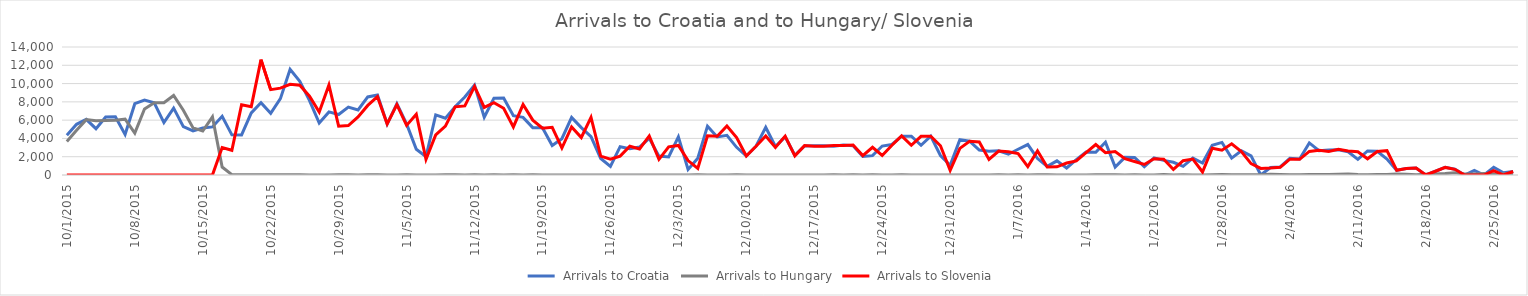
| Category | Series 0 | Series 1 | Series 2 |
|---|---|---|---|
| 10/1/15 | 4344 | 3667 | 0 |
| 10/2/15 | 5546 | 4897 | 0 |
| 10/3/15 | 6086 | 6056 | 0 |
| 10/4/15 | 5065 | 5925 | 0 |
| 10/5/15 | 6338 | 5952 | 0 |
| 10/6/15 | 6370 | 6000 | 0 |
| 10/7/15 | 4446 | 6103 | 0 |
| 10/8/15 | 7798 | 4583 | 6 |
| 10/9/15 | 8201 | 7215 | 0 |
| 10/10/15 | 7896 | 7907 | 0 |
| 10/11/15 | 5732 | 7897 | 0 |
| 10/12/15 | 7317 | 8702 | 0 |
| 10/13/15 | 5286 | 7081 | 0 |
| 10/14/15 | 4814 | 5157 | 0 |
| 10/15/15 | 5138 | 4808 | 0 |
| 10/16/15 | 5260 | 6353 | 0 |
| 10/17/15 | 6415 | 870 | 3000 |
| 10/18/15 | 4390 | 41 | 2700 |
| 10/19/15 | 4388 | 22 | 7677 |
| 10/20/15 | 6793 | 36 | 7478 |
| 10/21/15 | 7900 | 39 | 12616 |
| 10/22/15 | 6748 | 32 | 9339 |
| 10/23/15 | 8348 | 29 | 9500 |
| 10/24/15 | 11570 | 35 | 9925 |
| 10/25/15 | 10249 | 34 | 9818 |
| 10/26/15 | 8128 | 12 | 8625 |
| 10/27/15 | 5683 | 7 | 6877 |
| 10/28/15 | 6900 | 4 | 9848 |
| 10/29/15 | 6615 | 23 | 5341 |
| 10/30/15 | 7429 | 18 | 5409 |
| 10/31/15 | 7110 | 10 | 6344 |
| 11/1/15 | 8534 | 14 | 7611 |
| 11/2/15 | 8746 | 31 | 8568 |
| 11/3/15 | 5573 | 8 | 5591 |
| 11/4/15 | 7792 | 10 | 7693 |
| 11/5/15 | 5587 | 18 | 5426 |
| 11/6/15 | 2809 | 4 | 6655 |
| 11/7/15 | 2000 | 8 | 1716 |
| 11/8/15 | 6579 | 9 | 4381 |
| 11/9/15 | 6214 | 25 | 5341 |
| 11/10/15 | 7474 | 14 | 7457 |
| 11/11/15 | 8524 | 13 | 7554 |
| 11/12/15 | 9823 | 23 | 9681 |
| 11/13/15 | 6314 | 6 | 7397 |
| 11/14/15 | 8405 | 21 | 7905 |
| 11/15/15 | 8415 | 8 | 7300 |
| 11/16/15 | 6490 | 15 | 5261 |
| 11/17/15 | 6304 | 5 | 7704 |
| 11/18/15 | 5180 | 15 | 5998 |
| 11/19/15 | 5167 | 4 | 5119 |
| 11/20/15 | 3230 | 9 | 5211 |
| 11/21/15 | 3977 | 2 | 2952 |
| 11/22/15 | 6305 | 11 | 5260 |
| 11/23/15 | 5184 | 4 | 4102 |
| 11/24/15 | 4203 | 4 | 6297 |
| 11/25/15 | 1808 | 6 | 2070 |
| 11/26/15 | 952 | 10 | 1742 |
| 11/27/15 | 3095 | 2 | 2065 |
| 11/28/15 | 2886 | 6 | 3139 |
| 11/29/15 | 3060 | 3 | 2843 |
| 11/30/15 | 4009 | 7 | 4274 |
| 12/1/15 | 2066 | 4 | 1709 |
| 12/2/15 | 1982 | 4 | 3077 |
| 12/3/15 | 4174 | 9 | 3237 |
| 12/4/15 | 611 | 1 | 1577 |
| 12/5/15 | 1835 | 31 | 715 |
| 12/6/15 | 5339 | 7 | 4288 |
| 12/7/15 | 4162 | 0 | 4240 |
| 12/8/15 | 4335 | 13 | 5351 |
| 12/9/15 | 3027 | 14 | 4103 |
| 12/10/15 | 2076 | 3 | 2078 |
| 12/11/15 | 3149 | 0 | 3149 |
| 12/12/15 | 5225 | 13 | 4271 |
| 12/13/15 | 3112 | 10 | 3016 |
| 12/14/15 | 4174 | 3 | 4250 |
| 12/15/15 | 2160 | 2 | 2098 |
| 12/16/15 | 3177 | 6 | 3214 |
| 12/17/15 | 3192 | 0 | 3135 |
| 12/18/15 | 3200 | 11 | 3150 |
| 12/19/15 | 3156 | 31 | 3222 |
| 12/20/15 | 3276 | 8 | 3233 |
| 12/21/15 | 3210 | 25 | 3278 |
| 12/22/15 | 2027 | 1 | 2118 |
| 12/23/15 | 2116 | 21 | 3030 |
| 12/24/15 | 3166 | 8 | 2131 |
| 12/25/15 | 3339 | 2 | 3257 |
| 12/26/15 | 4241 | 17 | 4274 |
| 12/27/15 | 4251 | 10 | 3253 |
| 12/28/15 | 3249 | 0 | 4228 |
| 12/29/15 | 4253 | 0 | 4239 |
| 12/30/15 | 2132 | 11 | 3195 |
| 12/31/15 | 1058 | 5 | 511 |
| 1/1/16 | 3869 | 0 | 2914 |
| 1/2/16 | 3710 | 0 | 3690 |
| 1/3/16 | 2732 | 0 | 3619 |
| 1/4/16 | 2591 | 0 | 1708 |
| 1/5/16 | 2650 | 18 | 2626 |
| 1/6/16 | 2273 | 5 | 2550 |
| 1/7/16 | 2814 | 31 | 2337 |
| 1/8/16 | 3332 | 0 | 916 |
| 1/9/16 | 1799 | 15 | 2630 |
| 1/10/16 | 942 | 28 | 880 |
| 1/11/16 | 1549 | 7 | 897 |
| 1/12/16 | 769 | 2 | 1308 |
| 1/13/16 | 1679 | 0 | 1544 |
| 1/14/16 | 2502 | 4 | 2449 |
| 1/15/16 | 2493 | 30 | 3330 |
| 1/16/16 | 3579 | 30 | 2435 |
| 1/17/16 | 878 | 30 | 2570 |
| 1/18/16 | 1930 | 9 | 1783 |
| 1/19/16 | 1917 | 29 | 1476 |
| 1/20/16 | 914 | 0 | 1154 |
| 1/21/16 | 1865 | 10 | 1787 |
| 1/22/16 | 1599 | 47 | 1738 |
| 1/23/16 | 1394 | 10 | 606 |
| 1/24/16 | 946 | 15 | 1564 |
| 1/25/16 | 1847 | 5 | 1746 |
| 1/26/16 | 1309 | 4 | 326 |
| 1/27/16 | 3256 | 36 | 2935 |
| 1/28/16 | 3565 | 51 | 2719 |
| 1/29/16 | 1843 | 38 | 3416 |
| 1/30/16 | 2641 | 38 | 2556 |
| 1/31/16 | 2098 | 38 | 1249 |
| 2/1/16 | 0 | 31 | 716 |
| 2/2/16 | 822 | 69 | 765 |
| 2/3/16 | 881 | 46 | 841 |
| 2/4/16 | 1836 | 31 | 1733 |
| 2/5/16 | 1750 | 19 | 1713 |
| 2/6/16 | 3510 | 49 | 2580 |
| 2/7/16 | 2658 | 53 | 2694 |
| 2/8/16 | 2736 | 48 | 2582 |
| 2/9/16 | 2764 | 72 | 2805 |
| 2/10/16 | 2544 | 104 | 2637 |
| 2/11/16 | 1716 | 54 | 2547 |
| 2/12/16 | 2635 | 39 | 1774 |
| 2/13/16 | 2595 | 66 | 2576 |
| 2/14/16 | 1749 | 51 | 2660 |
| 2/15/16 | 512 | 119 | 516 |
| 2/16/16 | 701 | 93 | 715 |
| 2/17/16 | 769 | 34 | 769 |
| 2/18/16 | 0 | 73 | 0 |
| 2/19/16 | 408 | 113 | 408 |
| 2/20/16 | 834 | 151 | 828 |
| 2/21/16 | 630 | 237 | 623 |
| 2/22/16 | 0 | 103 | 0 |
| 2/23/16 | 507 | 112 | 0 |
| 2/24/16 | 0 | 166 | 0 |
| 2/25/16 | 841 | 76 | 478 |
| 2/26/16 | 250 | 140 | 0 |
| 2/27/16 | 385 | 111 | 382 |